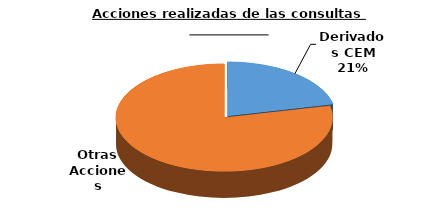
| Category | Series 0 |
|---|---|
| 0 | 50613 |
| 1 | 185178 |